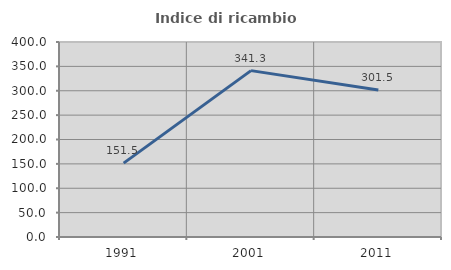
| Category | Indice di ricambio occupazionale  |
|---|---|
| 1991.0 | 151.515 |
| 2001.0 | 341.304 |
| 2011.0 | 301.493 |